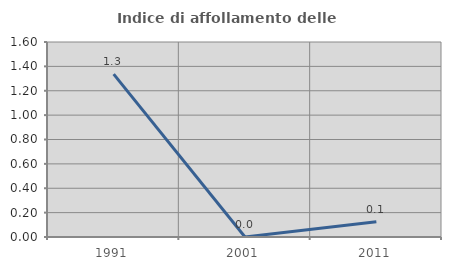
| Category | Indice di affollamento delle abitazioni  |
|---|---|
| 1991.0 | 1.336 |
| 2001.0 | 0 |
| 2011.0 | 0.126 |